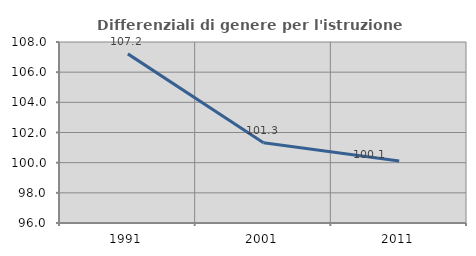
| Category | Differenziali di genere per l'istruzione superiore |
|---|---|
| 1991.0 | 107.213 |
| 2001.0 | 101.326 |
| 2011.0 | 100.109 |